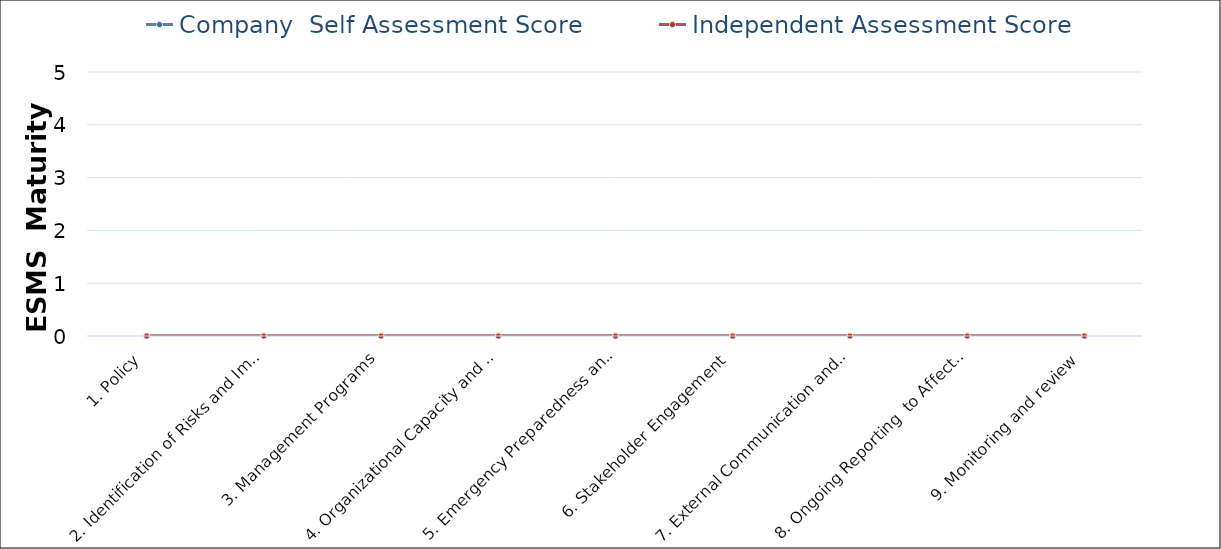
| Category | Company  Self Assessment Score | Independent Assessment Score |
|---|---|---|
| 1. Policy | 0 | 0 |
| 2. Identification of Risks and Impacts | 0 | 0 |
| 3. Management Programs | 0 | 0 |
| 4. Organizational Capacity and Competency | 0 | 0 |
| 5. Emergency Preparedness and Response | 0 | 0 |
| 6. Stakeholder Engagement | 0 | 0 |
| 7. External Communication and Grievance Mechanisms | 0 | 0 |
| 8. Ongoing Reporting  to Affected Communities | 0 | 0 |
| 9. Monitoring and review | 0 | 0 |